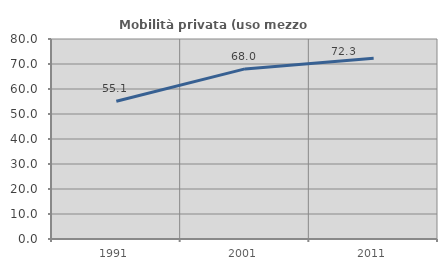
| Category | Mobilità privata (uso mezzo privato) |
|---|---|
| 1991.0 | 55.092 |
| 2001.0 | 68.035 |
| 2011.0 | 72.289 |